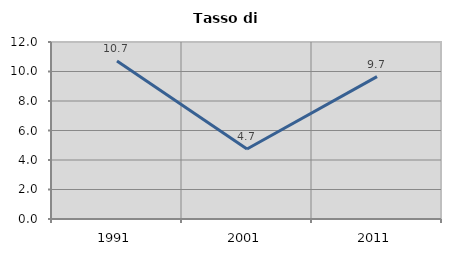
| Category | Tasso di disoccupazione   |
|---|---|
| 1991.0 | 10.716 |
| 2001.0 | 4.742 |
| 2011.0 | 9.651 |